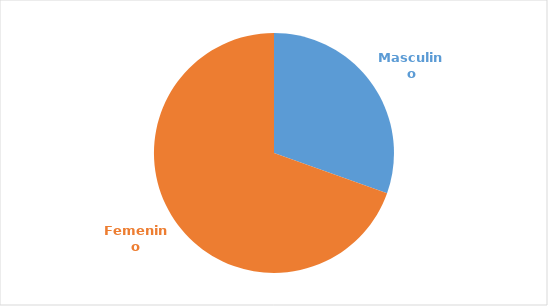
| Category | Series 0 |
|---|---|
| Masculino | 0.304 |
| Femenino | 0.696 |